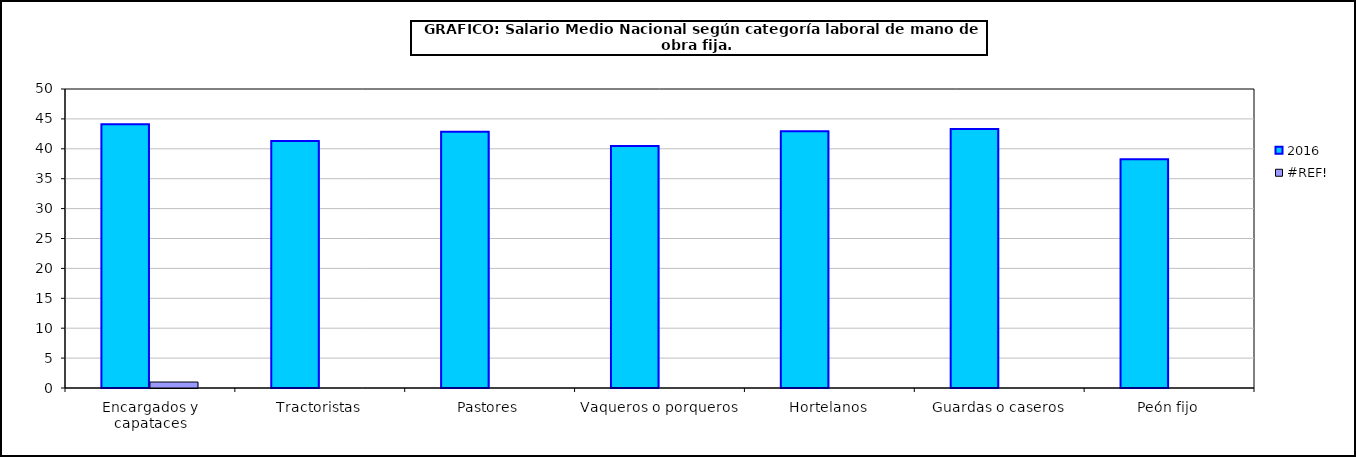
| Category | 2016 | #REF! |
|---|---|---|
| 0 |  | 1 |